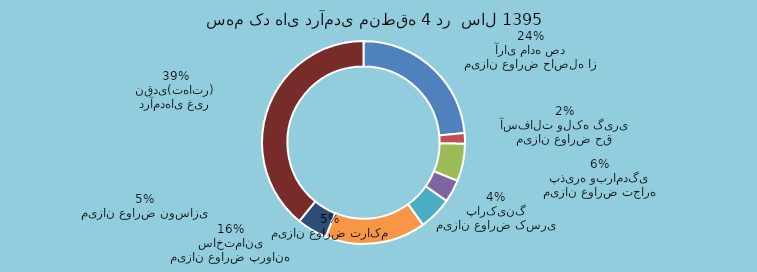
| Category | Series 0 | Series 1 |
|---|---|---|
| میزان عوارض حاصله از آرای ماده صد |  | 70056990 |
| میزان عوارض حق آسفالت ولکه گیری |  | 5011105 |
| میزان عوارض تجاره پذیره وبرامدگی |  | 17812557 |
| میزان عوارض کسری پارکینگ |  | 10712381 |
| میزان عوارض تراکم |  | 15748833 |
| میزان عوارض پروانه ساختمانی |  | 47729692 |
| میزان عوارض نوسازی |  | 14397204 |
| درآمدهای غیر نقدی(تهاتر) |  | 116478067 |